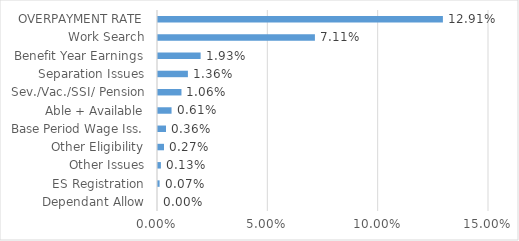
| Category | Series 0 |
|---|---|
| Dependant Allow | 0 |
| ES Registration | 0.001 |
| Other Issues | 0.001 |
| Other Eligibility | 0.003 |
| Base Period Wage Iss. | 0.004 |
| Able + Available | 0.006 |
| Sev./Vac./SSI/ Pension | 0.011 |
| Separation Issues | 0.014 |
| Benefit Year Earnings | 0.019 |
| Work Search | 0.071 |
| OVERPAYMENT RATE | 0.129 |